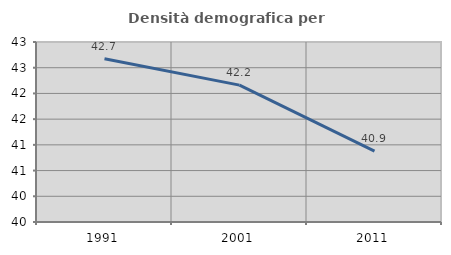
| Category | Densità demografica |
|---|---|
| 1991.0 | 42.675 |
| 2001.0 | 42.162 |
| 2011.0 | 40.879 |